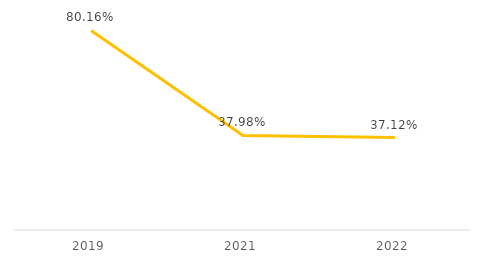
| Category | Series 0 |
|---|---|
| 2019.0 | 0.802 |
| 2021.0 | 0.38 |
| 2022.0 | 0.371 |